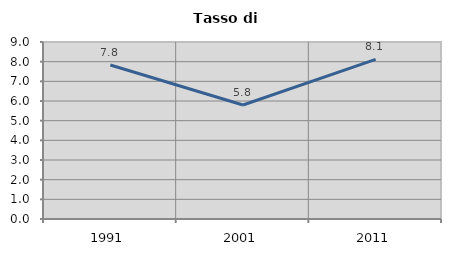
| Category | Tasso di disoccupazione   |
|---|---|
| 1991.0 | 7.831 |
| 2001.0 | 5.795 |
| 2011.0 | 8.12 |